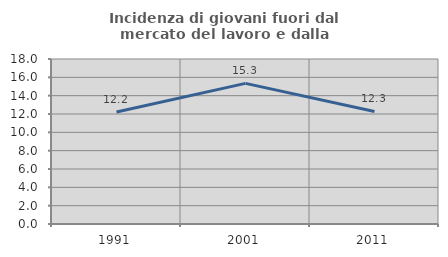
| Category | Incidenza di giovani fuori dal mercato del lavoro e dalla formazione  |
|---|---|
| 1991.0 | 12.209 |
| 2001.0 | 15.342 |
| 2011.0 | 12.274 |